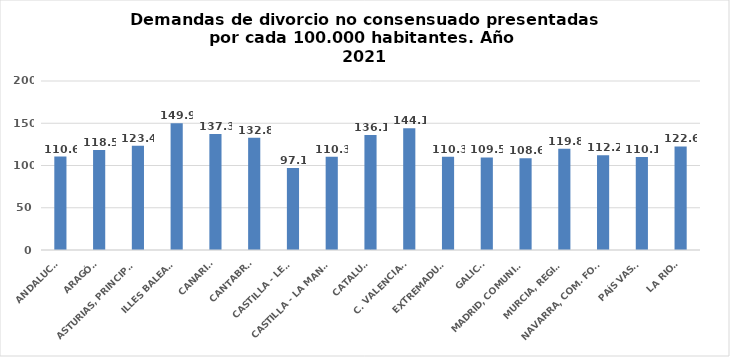
| Category | Series 0 |
|---|---|
| ANDALUCÍA | 110.643 |
| ARAGÓN | 118.453 |
| ASTURIAS, PRINCIPADO | 123.444 |
| ILLES BALEARS | 149.871 |
| CANARIAS | 137.279 |
| CANTABRIA | 132.761 |
| CASTILLA - LEÓN | 97.141 |
| CASTILLA - LA MANCHA | 110.267 |
| CATALUÑA | 136.127 |
| C. VALENCIANA | 144.065 |
| EXTREMADURA | 110.335 |
| GALICIA | 109.473 |
| MADRID, COMUNIDAD | 108.558 |
| MURCIA, REGIÓN | 119.79 |
| NAVARRA, COM. FORAL | 112.163 |
| PAÍS VASCO | 110.073 |
| LA RIOJA | 122.578 |